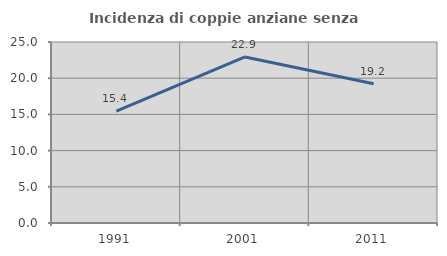
| Category | Incidenza di coppie anziane senza figli  |
|---|---|
| 1991.0 | 15.441 |
| 2001.0 | 22.936 |
| 2011.0 | 19.231 |